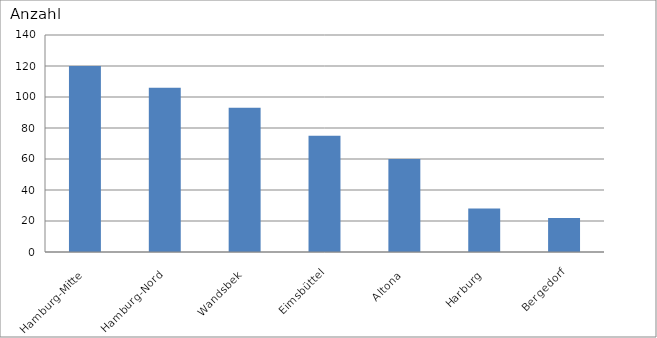
| Category | Hamburg-Mitte Hamburg-Nord Wandsbek Eimsbüttel Altona Harburg Bergedorf |
|---|---|
| Hamburg-Mitte | 120 |
| Hamburg-Nord | 106 |
| Wandsbek | 93 |
| Eimsbüttel | 75 |
| Altona | 60 |
| Harburg | 28 |
| Bergedorf | 22 |